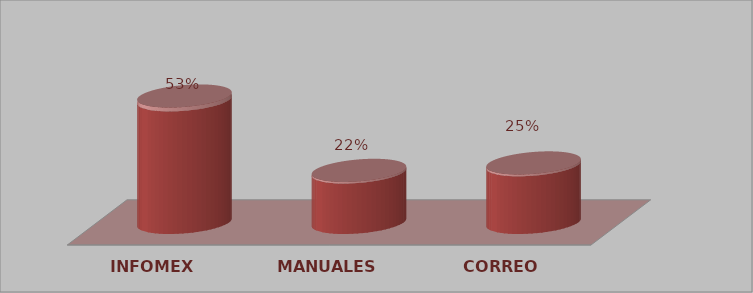
| Category | Series 0 | Series 1 |
|---|---|---|
| INFOMEX | 17 | 0.531 |
| MANUALES | 7 | 0.219 |
| CORREO | 8 | 0.25 |